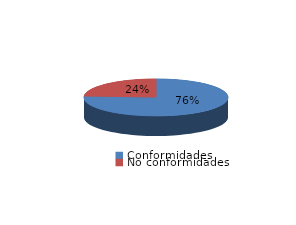
| Category | Series 0 |
|---|---|
| Conformidades | 1462 |
| No conformidades | 467 |